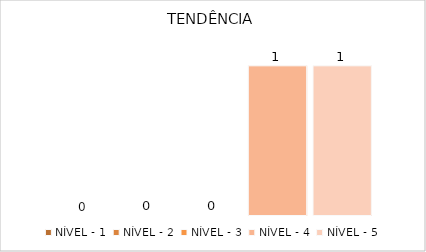
| Category | NÍVEL - 1 | NÍVEL - 2 | NÍVEL - 3 | NÍVEL - 4 | NÍVEL - 5 |
|---|---|---|---|---|---|
| TENDÊNCIA | 0 | 0 | 0 | 1 | 1 |